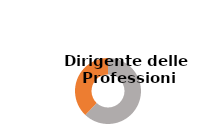
| Category | Series 0 |
|---|---|
| Donne  | 0.62 |
| Uomini  | 0.38 |